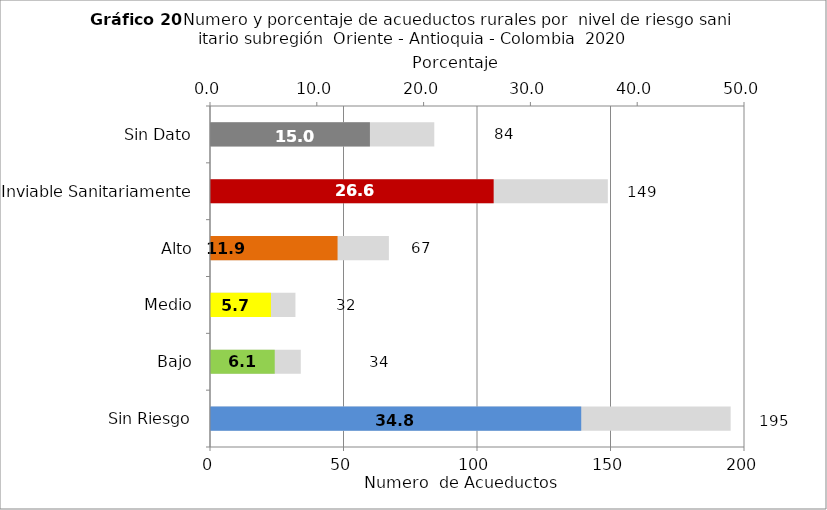
| Category | Número de Sistemas |
|---|---|
| Sin Riesgo | 195 |
| Bajo | 34 |
| Medio | 32 |
| Alto | 67 |
| Inviable Sanitariamente | 149 |
| Sin Dato | 84 |